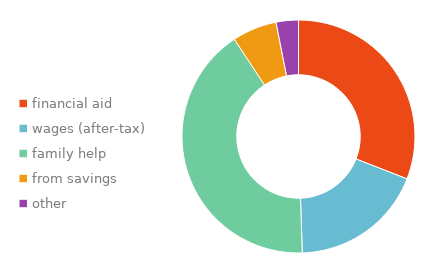
| Category | Series 0 |
|---|---|
| financial aid | 0.309 |
| wages (after-tax) | 0.186 |
| family help | 0.412 |
| from savings | 0.062 |
| other | 0.031 |